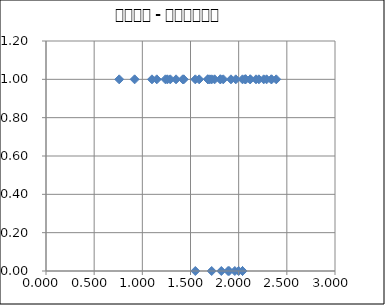
| Category | Series 0 |
|---|---|
| 1.1 | 1 |
| 0.92 | 1 |
| 1.72 | 1 |
| 2.18 | 1 |
| 1.75 | 1 |
| 2.26 | 1 |
| 2.07 | 1 |
| 1.43 | 1 |
| 1.92 | 1 |
| 1.82 | 0 |
| 2.34 | 1 |
| 2.12 | 1 |
| 1.81 | 1 |
| 1.35 | 1 |
| 1.26 | 1 |
| 2.07 | 1 |
| 2.04 | 1 |
| 1.55 | 0 |
| 1.89 | 0 |
| 1.68 | 1 |
| 0.76 | 1 |
| 1.96 | 0 |
| 1.29 | 1 |
| 1.81 | 1 |
| 1.72 | 0 |
| 2.39 | 1 |
| 1.68 | 1 |
| 2.29 | 1 |
| 2.34 | 1 |
| 2.21 | 1 |
| 1.42 | 1 |
| 1.97 | 1 |
| 2.12 | 1 |
| 1.9 | 0 |
| 1.15 | 1 |
| 1.7 | 1 |
| 1.24 | 1 |
| 1.55 | 1 |
| 2.04 | 0 |
| 1.59 | 1 |
| 2.07 | 1 |
| 2.0 | 0 |
| 1.84 | 1 |
| 2.04 | 0 |